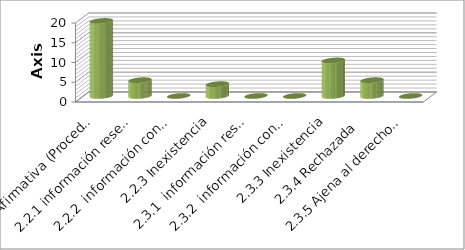
| Category | Series 0 |
|---|---|
| 2.1 Afirmativa (Procedente) | 19 |
| 2.2.1 información reservada | 4 |
| 2.2.2  información confidencial | 0 |
| 2.2.3 Inexistencia | 3 |
| 2.3.1  información reservada | 0 |
| 2.3.2  información confidencial | 0 |
| 2.3.3 Inexistencia | 9 |
| 2.3.4 Rechazada  | 4 |
| 2.3.5 Ajena al derecho de Inf. | 0 |